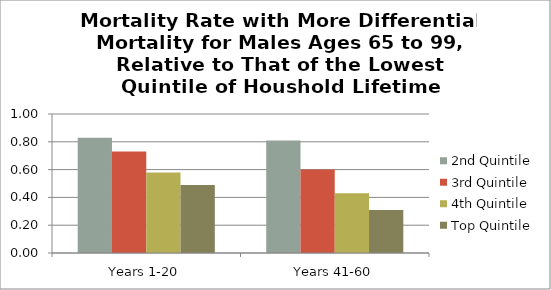
| Category | 2nd Quintile | 3rd Quintile | 4th Quintile | Top Quintile |
|---|---|---|---|---|
| Years 1-20 | 0.83 | 0.73 | 0.58 | 0.49 |
| Years 41-60 | 0.81 | 0.6 | 0.43 | 0.31 |